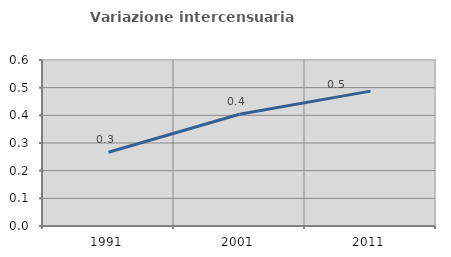
| Category | Variazione intercensuaria annua |
|---|---|
| 1991.0 | 0.266 |
| 2001.0 | 0.404 |
| 2011.0 | 0.487 |